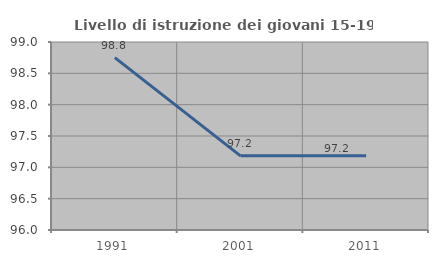
| Category | Livello di istruzione dei giovani 15-19 anni |
|---|---|
| 1991.0 | 98.75 |
| 2001.0 | 97.183 |
| 2011.0 | 97.183 |